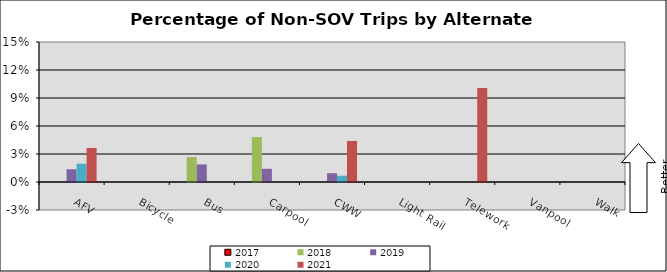
| Category | 2017 | 2018 | 2019 | 2020 | 2021 |
|---|---|---|---|---|---|
| AFV | 0 | 0 | 0.014 | 0.02 | 0.036 |
| Bicycle | 0 | 0 | 0 | 0 | 0 |
| Bus | 0 | 0.027 | 0.019 | 0 | 0 |
| Carpool | 0 | 0.048 | 0.014 | 0 | 0 |
| CWW | 0 | 0 | 0.009 | 0.007 | 0.044 |
| Light Rail | 0 | 0 | 0 | 0 | 0 |
| Telework | 0 | 0 | 0 | 0 | 0.101 |
| Vanpool | 0 | 0 | 0 | 0 | 0 |
| Walk | 0 | 0 | 0 | 0 | 0 |